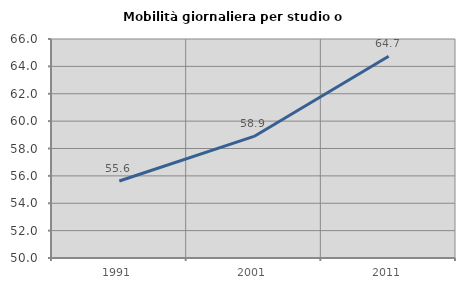
| Category | Mobilità giornaliera per studio o lavoro |
|---|---|
| 1991.0 | 55.627 |
| 2001.0 | 58.882 |
| 2011.0 | 64.744 |